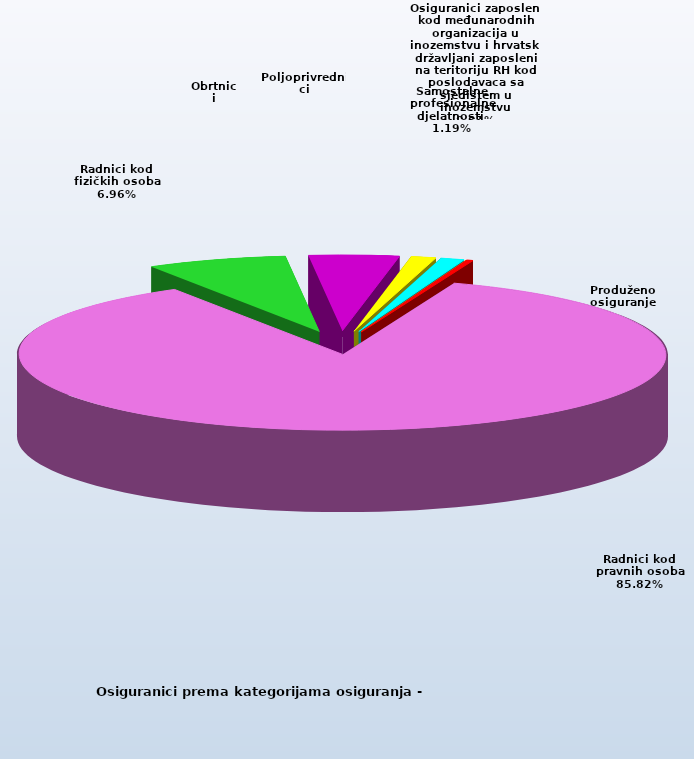
| Category | Series 0 |
|---|---|
| Radnici kod pravnih osoba | 1322955 |
| Radnici kod fizičkih osoba | 107344 |
| Obrtnici | 68987 |
| Poljoprivrednici | 19187 |
| Samostalne profesionalne djelatnosti  | 18323 |
| Osiguranici zaposleni kod međunarodnih organizacija u inozemstvu i hrvatski državljani zaposleni na teritoriju RH kod poslodavaca sa sjedištem u inozemstvu | 82 |
| Produženo osiguranje | 4735 |